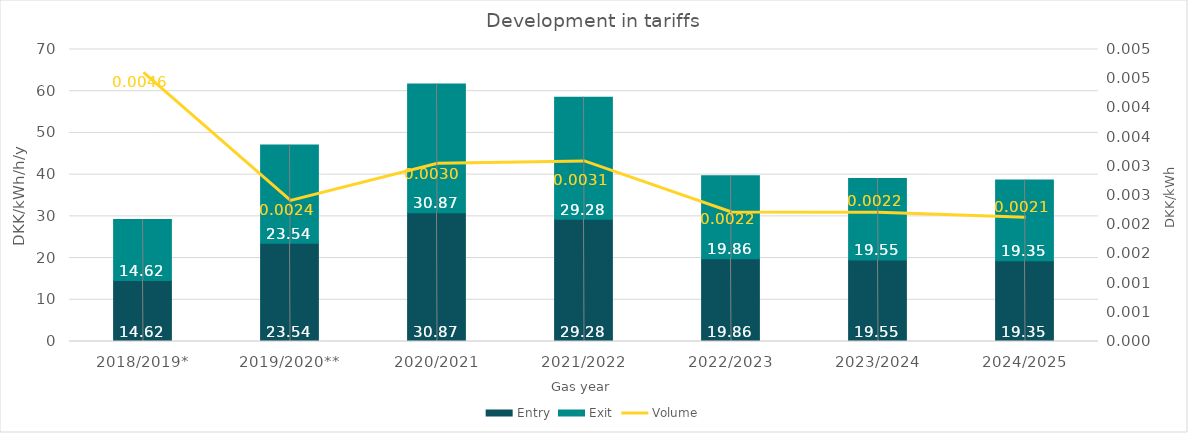
| Category | Entry | Exit |
|---|---|---|
| 2018/2019* | 14.62 | 14.62 |
| 2019/2020** | 23.54 | 23.54 |
| 2020/2021 | 30.873 | 30.873 |
| 2021/2022 | 29.277 | 29.277 |
| 2022/2023 | 19.862 | 19.862 |
| 2023/2024 | 19.552 | 19.552 |
| 2024/2025 | 19.354 | 19.354 |